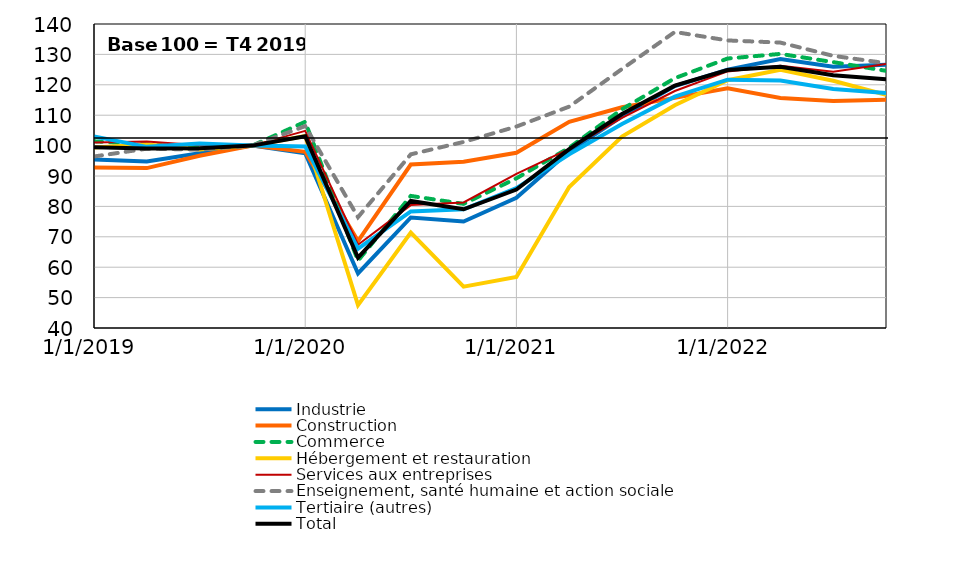
| Category | Industrie | Construction | Commerce | Hébergement et restauration | Services aux entreprises | Enseignement, santé humaine et action sociale | Tertiaire (autres) | Total |
|---|---|---|---|---|---|---|---|---|
| 1/1/19 | 95.462 | 92.804 | 101.43 | 99.386 | 101.031 | 96.419 | 103.028 | 99.449 |
| 4/1/19 | 94.806 | 92.604 | 100.383 | 100.397 | 101.383 | 98.99 | 99.592 | 99.036 |
| 7/1/19 | 97.48 | 96.647 | 99.277 | 98.683 | 100.129 | 98.703 | 100.705 | 99.123 |
| 10/1/19 | 100 | 100 | 100 | 100 | 100 | 100 | 100 | 100 |
| 1/1/20 | 97.486 | 97.947 | 107.833 | 103.166 | 104.852 | 106.417 | 99.73 | 103.054 |
| 4/1/20 | 57.931 | 68.593 | 62.128 | 47.532 | 67.399 | 76.462 | 66.074 | 63.117 |
| 7/1/20 | 76.351 | 93.773 | 83.448 | 71.372 | 80.429 | 97.129 | 78.333 | 81.803 |
| 10/1/20 | 75.022 | 94.709 | 80.834 | 53.602 | 81.313 | 101.203 | 79.057 | 79.059 |
| 1/1/21 | 82.851 | 97.646 | 89.229 | 56.767 | 90.717 | 106.264 | 85.98 | 85.559 |
| 4/1/21 | 98.053 | 107.85 | 99.304 | 86.382 | 98.939 | 112.822 | 97.152 | 98.857 |
| 7/1/21 | 109.64 | 112.618 | 111.957 | 102.96 | 109.152 | 125.198 | 107.11 | 110.399 |
| 10/1/21 | 119.588 | 115.708 | 122.181 | 113.298 | 117.954 | 137.383 | 116.083 | 119.708 |
| 1/1/22 | 125 | 118.868 | 128.643 | 121.494 | 124.407 | 134.591 | 121.696 | 124.881 |
| 4/1/22 | 128.496 | 115.679 | 130.164 | 124.956 | 126.28 | 133.887 | 121.383 | 125.937 |
| 7/1/22 | 125.954 | 114.674 | 127.463 | 121.311 | 124.286 | 129.523 | 118.626 | 123.174 |
| 10/1/22 | 126.609 | 115.043 | 124.598 | 116.687 | 126.828 | 127.124 | 117.261 | 121.857 |